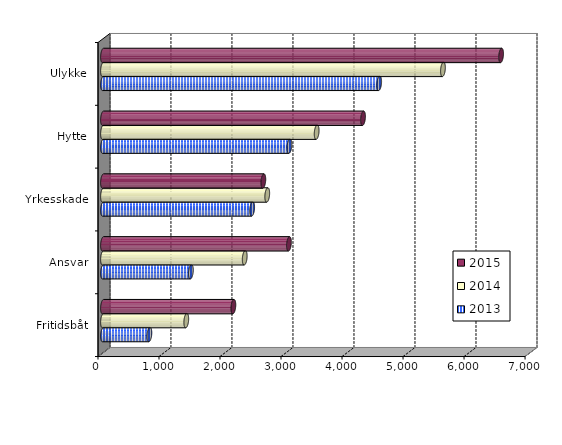
| Category | 2013 | 2014 | 2015 |
|---|---|---|---|
| Fritidsbåt | 760.322 | 1365 | 2137 |
| Ansvar | 1440.347 | 2323 | 3048 |
| Yrkesskade | 2444.985 | 2692 | 2628 |
| Hytte | 3055.954 | 3502 | 4262 |
| Ulykke | 4526.895 | 5572.091 | 6525 |